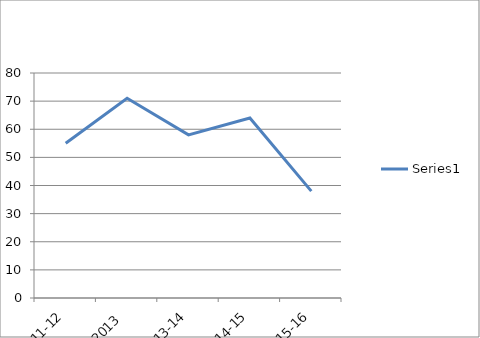
| Category | Series 0 |
|---|---|
| 2011-12 | 55 |
| 2012-2013 | 71 |
| 2013-14 | 58 |
| 2014-15 | 64 |
| 2015-16 | 38 |